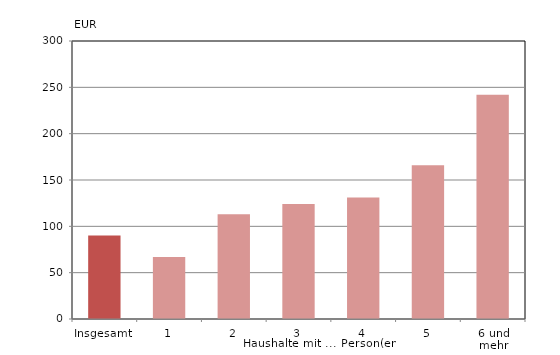
| Category | Series 0 |
|---|---|
| Insgesamt | 90 |
| 1 | 67 |
| 2 | 113 |
| 3 | 124 |
| 4 | 131 |
| 5 | 166 |
| 6 und mehr | 242 |